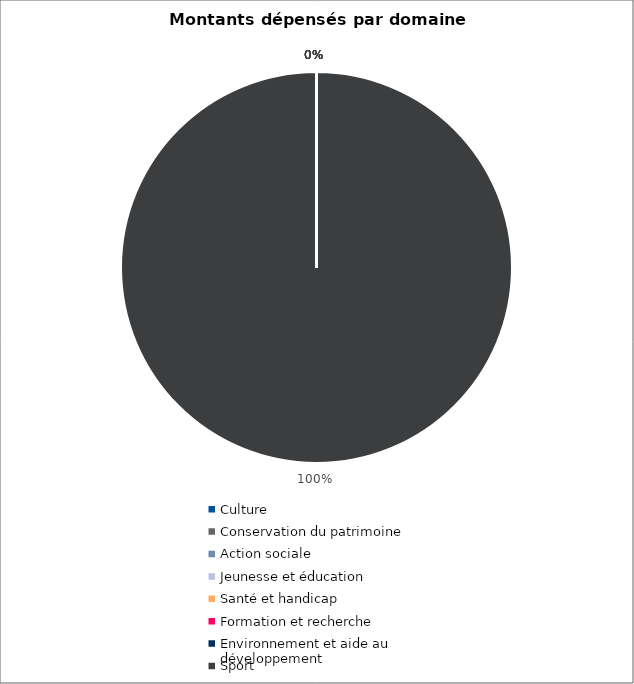
| Category | Series 0 |
|---|---|
| Culture | 0 |
| Conservation du patrimoine | 0 |
| Action sociale | 0 |
| Jeunesse et éducation | 0 |
| Santé et handicap | 0 |
| Formation et recherche | 0 |
| Environnement et aide au
développement | 0 |
| Sport | 4957160 |
| Autres projets d’utilité publique | 0 |